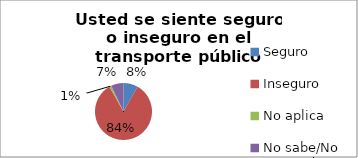
| Category | Series 0 |
|---|---|
| Seguro | 0.082 |
| Inseguro | 0.835 |
| No aplica | 0.012 |
| No sabe/No responde | 0.071 |